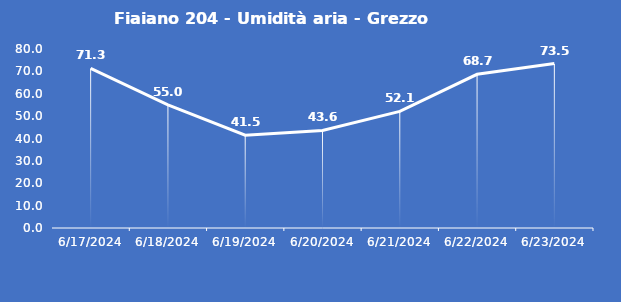
| Category | Fiaiano 204 - Umidità aria - Grezzo (%) |
|---|---|
| 6/17/24 | 71.3 |
| 6/18/24 | 55 |
| 6/19/24 | 41.5 |
| 6/20/24 | 43.6 |
| 6/21/24 | 52.1 |
| 6/22/24 | 68.7 |
| 6/23/24 | 73.5 |